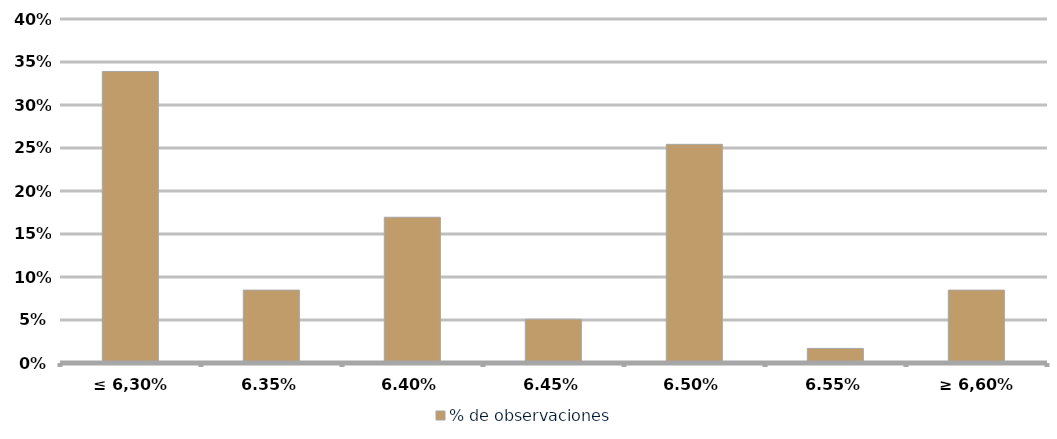
| Category | % de observaciones  |
|---|---|
| ≤ 6,30% | 0.339 |
| 6,35% | 0.085 |
| 6,40% | 0.169 |
| 6,45% | 0.051 |
| 6,50% | 0.254 |
| 6,55% | 0.017 |
| ≥ 6,60% | 0.085 |